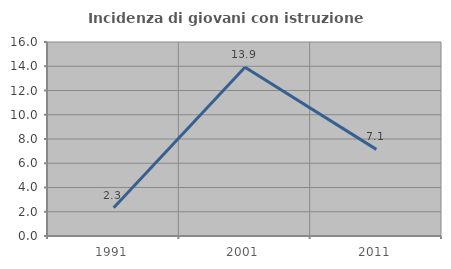
| Category | Incidenza di giovani con istruzione universitaria |
|---|---|
| 1991.0 | 2.326 |
| 2001.0 | 13.924 |
| 2011.0 | 7.143 |